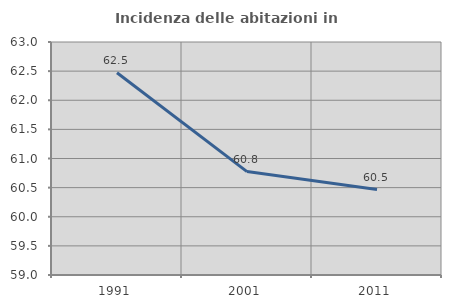
| Category | Incidenza delle abitazioni in proprietà  |
|---|---|
| 1991.0 | 62.472 |
| 2001.0 | 60.775 |
| 2011.0 | 60.467 |